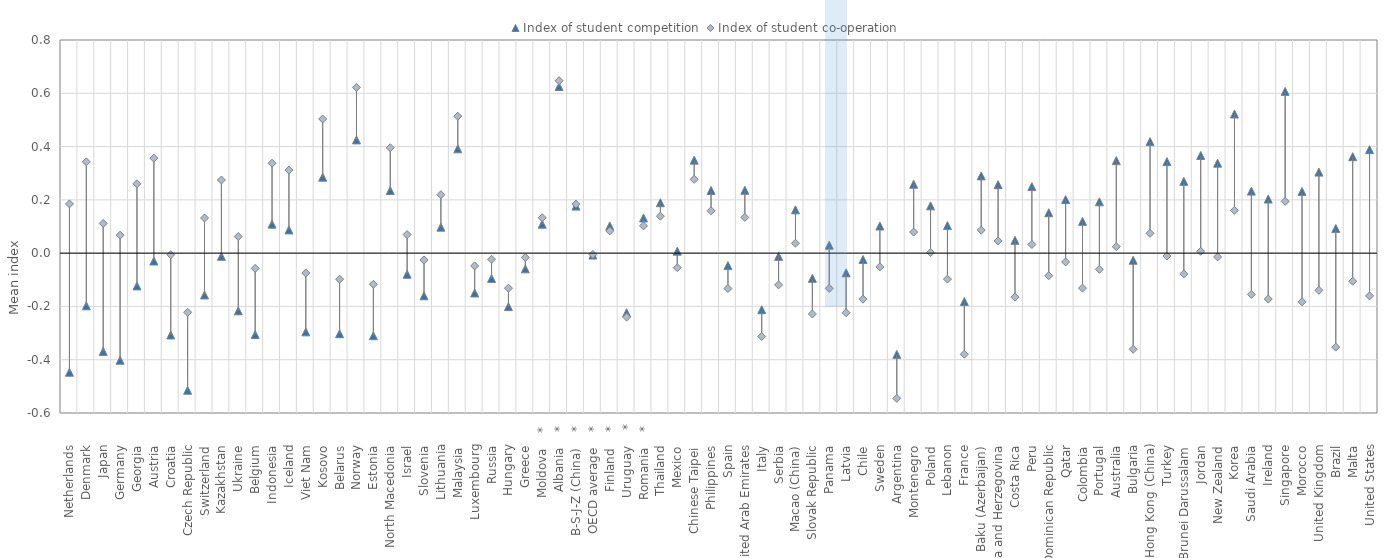
| Category | Index of student competition | Index of student co-operation |
|---|---|---|
| Netherlands      | -0.447 | 0.185 |
| Denmark      | -0.198 | 0.343 |
| Japan      | -0.369 | 0.112 |
| Germany      | -0.402 | 0.068 |
| Georgia      | -0.123 | 0.26 |
| Austria      | -0.03 | 0.356 |
| Croatia      | -0.307 | -0.006 |
| Czech Republic      | -0.515 | -0.222 |
| Switzerland      | -0.157 | 0.132 |
| Kazakhstan      | -0.012 | 0.275 |
| Ukraine      | -0.216 | 0.062 |
| Belgium      | -0.306 | -0.057 |
| Indonesia      | 0.109 | 0.338 |
| Iceland      | 0.087 | 0.312 |
| Viet Nam      | -0.295 | -0.075 |
| Kosovo      | 0.285 | 0.504 |
| Belarus      | -0.302 | -0.098 |
| Norway      | 0.425 | 0.622 |
| Estonia      | -0.31 | -0.117 |
| North Macedonia      | 0.235 | 0.396 |
| Israel      | -0.079 | 0.07 |
| Slovenia      | -0.16 | -0.026 |
| Lithuania      | 0.098 | 0.219 |
| Malaysia      | 0.392 | 0.514 |
| Luxembourg      | -0.149 | -0.048 |
| Russia      | -0.095 | -0.023 |
| Hungary      | -0.201 | -0.131 |
| Greece      | -0.059 | -0.016 |
| Moldova    * | 0.109 | 0.133 |
| Albania    * | 0.625 | 0.647 |
| B-S-J-Z (China)    * | 0.177 | 0.184 |
| OECD average    * | -0.007 | -0.005 |
| Finland    * | 0.102 | 0.083 |
| Uruguay    * | -0.223 | -0.24 |
| Romania    * | 0.132 | 0.102 |
| Thailand      | 0.189 | 0.139 |
| Mexico      | 0.007 | -0.055 |
| Chinese Taipei      | 0.349 | 0.277 |
| Philippines      | 0.235 | 0.159 |
| Spain      | -0.047 | -0.133 |
| United Arab Emirates      | 0.236 | 0.134 |
| Italy      | -0.212 | -0.313 |
| Serbia      | -0.012 | -0.119 |
| Macao (China)      | 0.162 | 0.037 |
| Slovak Republic      | -0.095 | -0.228 |
| Panama      | 0.03 | -0.132 |
| Latvia      | -0.074 | -0.224 |
| Chile      | -0.024 | -0.173 |
| Sweden      | 0.102 | -0.052 |
| Argentina      | -0.38 | -0.545 |
| Montenegro      | 0.259 | 0.079 |
| Poland      | 0.177 | 0.002 |
| Lebanon      | 0.103 | -0.098 |
| France      | -0.182 | -0.38 |
| Baku (Azerbaijan)      | 0.29 | 0.086 |
| Bosnia and Herzegovina      | 0.257 | 0.046 |
| Costa Rica      | 0.048 | -0.165 |
| Peru      | 0.25 | 0.033 |
| Dominican Republic      | 0.152 | -0.085 |
| Qatar      | 0.201 | -0.033 |
| Colombia      | 0.119 | -0.131 |
| Portugal      | 0.193 | -0.061 |
| Australia      | 0.347 | 0.024 |
| Bulgaria      | -0.027 | -0.361 |
| Hong Kong (China)      | 0.419 | 0.074 |
| Turkey      | 0.344 | -0.011 |
| Brunei Darussalam      | 0.27 | -0.078 |
| Jordan      | 0.367 | 0.007 |
| New Zealand      | 0.338 | -0.014 |
| Korea      | 0.522 | 0.161 |
| Saudi Arabia      | 0.233 | -0.155 |
| Ireland      | 0.203 | -0.172 |
| Singapore      | 0.607 | 0.194 |
| Morocco      | 0.232 | -0.183 |
| United Kingdom      | 0.304 | -0.14 |
| Brazil      | 0.093 | -0.353 |
| Malta      | 0.362 | -0.106 |
| United States      | 0.388 | -0.16 |